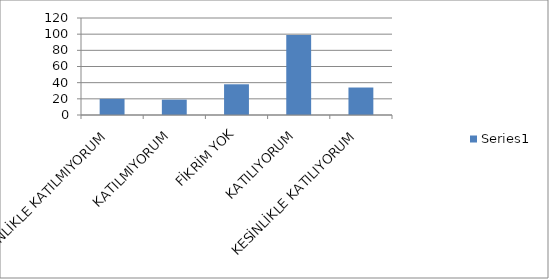
| Category | Series 0 |
|---|---|
| KESİNLİKLE KATILMIYORUM | 20 |
| KATILMIYORUM | 19 |
| FİKRİM YOK | 38 |
| KATILIYORUM | 99 |
| KESİNLİKLE KATILIYORUM | 34 |